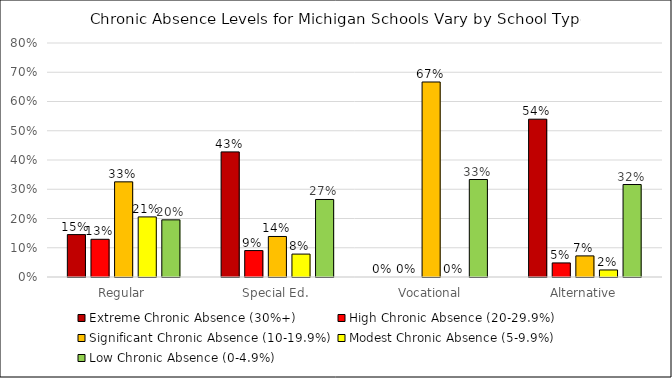
| Category | Extreme Chronic Absence (30%+) | High Chronic Absence (20-29.9%) | Significant Chronic Absence (10-19.9%) | Modest Chronic Absence (5-9.9%) | Low Chronic Absence (0-4.9%) |
|---|---|---|---|---|---|
| Regular | 0.145 | 0.129 | 0.325 | 0.205 | 0.195 |
| Special Ed. | 0.428 | 0.09 | 0.139 | 0.078 | 0.265 |
| Vocational | 0 | 0 | 0.667 | 0 | 0.333 |
| Alternative | 0.54 | 0.048 | 0.072 | 0.024 | 0.316 |